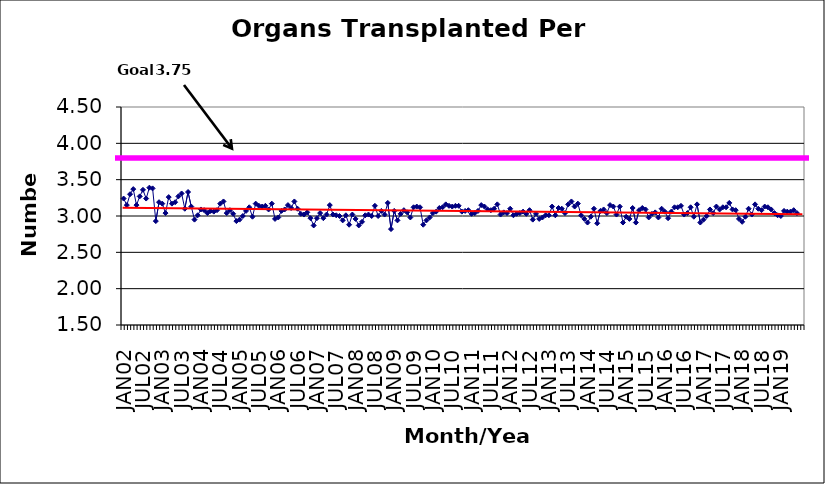
| Category | Series 0 |
|---|---|
| JAN02 | 3.24 |
| FEB02 | 3.15 |
| MAR02 | 3.3 |
| APR02 | 3.37 |
| MAY02 | 3.15 |
| JUN02 | 3.27 |
| JUL02 | 3.36 |
| AUG02 | 3.24 |
| SEP02 | 3.39 |
| OCT02 | 3.38 |
| NOV02 | 2.93 |
| DEC02 | 3.19 |
| JAN03 | 3.17 |
| FEB03 | 3.04 |
| MAR03 | 3.26 |
| APR03 | 3.17 |
| MAY03 | 3.19 |
| JUN03 | 3.27 |
| JUL03 | 3.31 |
| AUG03 | 3.1 |
| SEP03 | 3.33 |
| OCT03 | 3.13 |
| NOV03 | 2.95 |
| DEC03 | 3.01 |
| JAN04 | 3.09 |
| FEB04 | 3.08 |
| MAR04 | 3.04 |
| APR04 | 3.07 |
| MAY04 | 3.06 |
| JUN04 | 3.08 |
| JUL04 | 3.17 |
| AUG04 | 3.2 |
| SEP04 | 3.04 |
| OCT04 | 3.08 |
| NOV04 | 3.03 |
| DEC04 | 2.93 |
| JAN05 | 2.95 |
| FEB05 | 3 |
| MAR05 | 3.07 |
| APR05 | 3.12 |
| MAY05 | 2.99 |
| JUN05 | 3.17 |
| JUL05 | 3.14 |
| AUG05 | 3.13 |
| SEP05 | 3.14 |
| OCT05 | 3.09 |
| NOV05 | 3.17 |
| DEC05 | 2.96 |
| JAN06 | 2.98 |
| FEB06 | 3.07 |
| MAR06 | 3.09 |
| APR06 | 3.15 |
| MAY06 | 3.11 |
| JUN06 | 3.2 |
| JUL06 | 3.1 |
| AUG06 | 3.03 |
| SEP06 | 3.02 |
| OCT06 | 3.05 |
| NOV06 | 2.97 |
| DEC06 | 2.87 |
| JAN07 | 2.97 |
| FEB07 | 3.04 |
| MAR07 | 2.97 |
| APR07 | 3.02 |
| MAY07 | 3.15 |
| JUN07 | 3.02 |
| JUL07 | 3.01 |
| AUG07 | 3 |
| SEP07 | 2.94 |
| OCT07 | 3.01 |
| NOV07 | 2.88 |
| DEC07 | 3.02 |
| JAN08 | 2.96 |
| FEB08 | 2.87 |
| MAR08 | 2.92 |
| APR08 | 3.01 |
| MAY08 | 3.02 |
| JUN08 | 3 |
| JUL08 | 3.14 |
| AUG08 | 3 |
| SEP08 | 3.07 |
| OCT08 | 3.02 |
| NOV08 | 3.18 |
| DEC08 | 2.82 |
| JAN09 | 3.07 |
| FEB09 | 2.94 |
| MAR09 | 3.03 |
| APR09 | 3.08 |
| MAY09 | 3.05 |
| JUN09 | 2.98 |
| JUL09 | 3.12 |
| AUG09 | 3.13 |
| SEP09 | 3.12 |
| OCT09 | 2.88 |
| NOV09 | 2.94 |
| DEC09 | 2.98 |
| JAN10 | 3.04 |
| FEB10 | 3.06 |
| MAR10 | 3.11 |
| APR10 | 3.12 |
| MAY10 | 3.16 |
| JUN10 | 3.14 |
| JUL10 | 3.13 |
| AUG10 | 3.14 |
| SEP10 | 3.14 |
| OCT10 | 3.06 |
| NOV10 | 3.07 |
| DEC10 | 3.08 |
| JAN11 | 3.03 |
| FEB11 | 3.04 |
| MAR11 | 3.07 |
| APR11 | 3.15 |
| MAY11 | 3.13 |
| JUN11 | 3.09 |
| JUL11 | 3.08 |
| AUG11 | 3.1 |
| SEP11 | 3.16 |
| OCT11 | 3.02 |
| NOV11 | 3.05 |
| DEC11 | 3.04 |
| JAN12 | 3.1 |
| FEB12 | 3.01 |
| MAR12 | 3.03 |
| APR12 | 3.04 |
| MAY12 | 3.06 |
| JUN12 | 3.03 |
| JUL12 | 3.08 |
| AUG12 | 2.95 |
| SEP12 | 3.03 |
| OCT12 | 2.96 |
| NOV12 | 2.98 |
| DEC12 | 3.01 |
| JAN13 | 3.01 |
| FEB13 | 3.13 |
| MAR13 | 3.01 |
| APR13 | 3.11 |
| MAY13 | 3.1 |
| JUN13 | 3.04 |
| JUL13 | 3.16 |
| AUG13 | 3.2 |
| SEP13 | 3.13 |
| OCT13 | 3.17 |
| NOV13 | 3.01 |
| DEC13 | 2.96 |
| JAN14 | 2.91 |
| FEB14 | 2.99 |
| MAR14 | 3.1 |
| APR14 | 2.9 |
| MAY14 | 3.07 |
| JUN14 | 3.09 |
| JUL14 | 3.04 |
| AUG14 | 3.15 |
| SEP14 | 3.13 |
| OCT14 | 3.02 |
| NOV14 | 3.13 |
| DEC14 | 2.91 |
| JAN15 | 2.99 |
| FEB15 | 2.96 |
| MAR15 | 3.11 |
| APR15 | 2.91 |
| MAY15 | 3.08 |
| JUN15 | 3.11 |
| JUL15 | 3.09 |
| AUG15 | 2.98 |
| SEP15 | 3.03 |
| OCT15 | 3.05 |
| NOV15 | 2.98 |
| DEC15 | 3.1 |
| JAN16 | 3.06 |
| FEB16 | 2.97 |
| MAR16 | 3.06 |
| APR16 | 3.12 |
| MAY16 | 3.12 |
| JUN16 | 3.14 |
| JUL16 | 3.02 |
| AUG16 | 3.04 |
| SEP16 | 3.12 |
| OCT16 | 2.99 |
| NOV16 | 3.16 |
| DEC16 | 2.91 |
| JAN17 | 2.95 |
| FEB17 | 3 |
| MAR17 | 3.09 |
| APR17 | 3.04 |
| MAY17 | 3.13 |
| JUN17 | 3.09 |
| JUL17 | 3.12 |
| AUG17 | 3.12 |
| SEP17 | 3.18 |
| OCT17 | 3.09 |
| NOV17 | 3.08 |
| DEC17 | 2.96 |
| JAN18 | 2.92 |
| FEB18 | 2.99 |
| MAR18 | 3.1 |
| APR18 | 3.02 |
| MAY18 | 3.16 |
| JUN18 | 3.1 |
| JUL18 | 3.08 |
| AUG18 | 3.13 |
| SEP18 | 3.12 |
| OCT18 | 3.09 |
| NOV18 | 3.04 |
| DEC18 | 3.01 |
| JAN19 | 3 |
| FEB19 | 3.07 |
| MAR19 | 3.06 |
| APR19 | 3.06 |
| MAY19 | 3.08 |
| JUN19 | 3.04 |